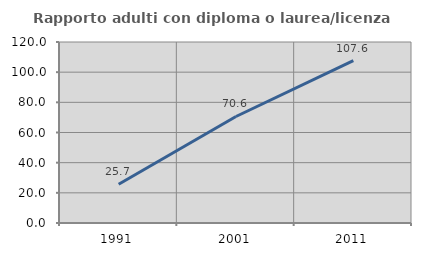
| Category | Rapporto adulti con diploma o laurea/licenza media  |
|---|---|
| 1991.0 | 25.665 |
| 2001.0 | 70.616 |
| 2011.0 | 107.62 |